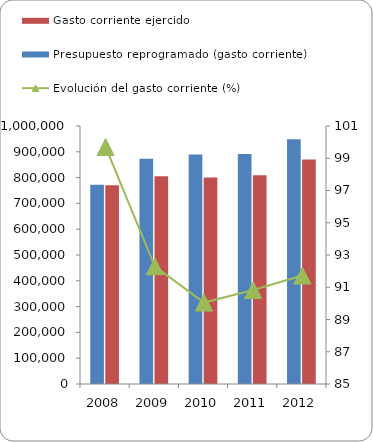
| Category | Presupuesto reprogramado (gasto corriente) | Gasto corriente ejercido |
|---|---|---|
| 2008 | 772288 | 769961 |
| 2009 | 872668 | 805455 |
| 2010 | 889296 | 800820 |
| 2011 | 891084 | 809367 |
| 2012 | 948195.8 | 869726.3 |